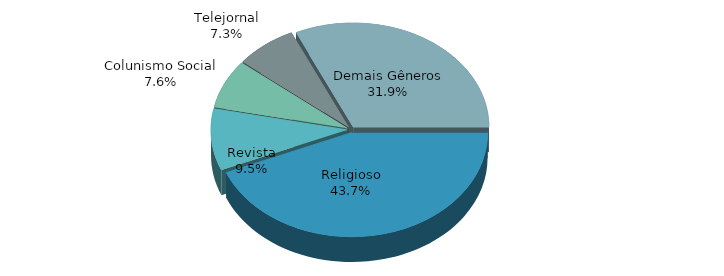
| Category | Series 0 |
|---|---|
| Religioso | 0.437 |
| Revista | 0.095 |
| Colunismo Social | 0.076 |
| Telejornal | 0.073 |
| Demais Gêneros | 0.319 |